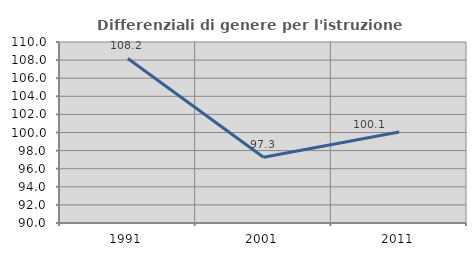
| Category | Differenziali di genere per l'istruzione superiore |
|---|---|
| 1991.0 | 108.184 |
| 2001.0 | 97.259 |
| 2011.0 | 100.063 |